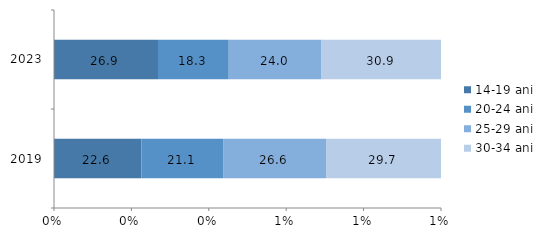
| Category | 14-19 ani | 20-24 ani | 25-29 ani | 30-34 ani |
|---|---|---|---|---|
| 2019.0 | 22.6 | 21.1 | 26.6 | 29.7 |
| 2023.0 | 26.9 | 18.3 | 24 | 30.9 |